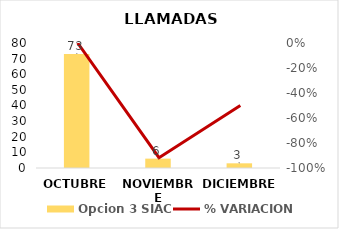
| Category | Opcion 3 SIAC |
|---|---|
| OCTUBRE | 73 |
| NOVIEMBRE | 6 |
| DICIEMBRE | 3 |